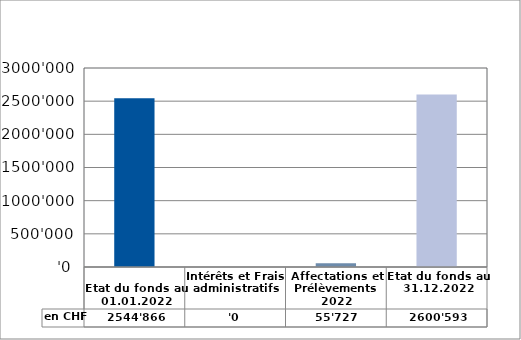
| Category | en CHF |
|---|---|
| 
Etat du fonds au 01.01.2022

 | 2544865.89 |
| Intérêts et Frais administratifs | 0 |
| Affectations et Prélèvements 2022 | 55727.45 |
| Etat du fonds au 31.12.2022 | 2600593.34 |